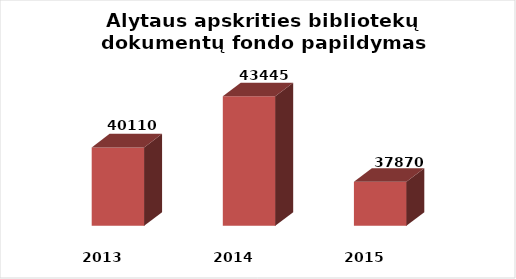
| Category | Series 0 |
|---|---|
| 2013.0 | 40110 |
| 2014.0 | 43445 |
| 2015.0 | 37870 |